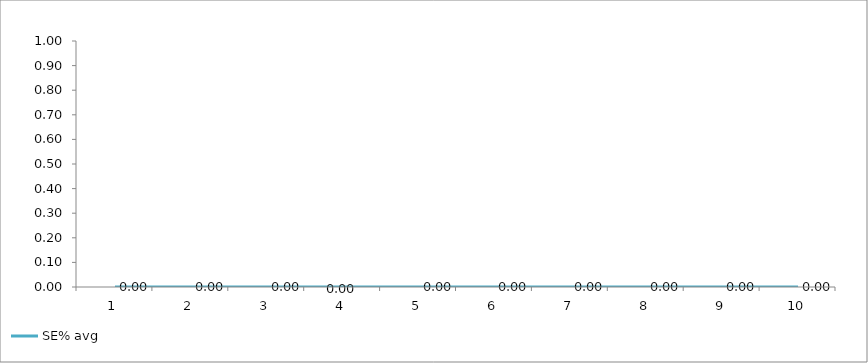
| Category | SE% avg |
|---|---|
| 0 | 0 |
| 1 | 0 |
| 2 | 0 |
| 3 | 0 |
| 4 | 0 |
| 5 | 0 |
| 6 | 0 |
| 7 | 0 |
| 8 | 0 |
| 9 | 0 |